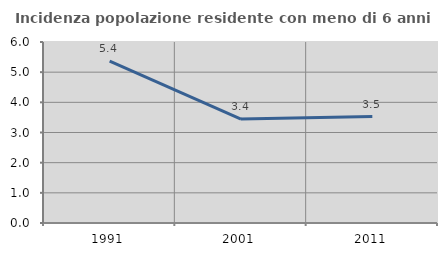
| Category | Incidenza popolazione residente con meno di 6 anni |
|---|---|
| 1991.0 | 5.369 |
| 2001.0 | 3.445 |
| 2011.0 | 3.528 |